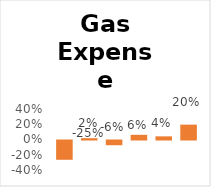
| Category | Series 0 |
|---|---|
| 0 | -0.253 |
| 1 | 0.017 |
| 2 | -0.062 |
| 3 | 0.061 |
| 4 | 0.041 |
| 5 | 0.195 |